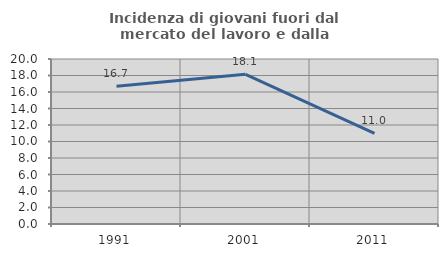
| Category | Incidenza di giovani fuori dal mercato del lavoro e dalla formazione  |
|---|---|
| 1991.0 | 16.694 |
| 2001.0 | 18.142 |
| 2011.0 | 10.976 |